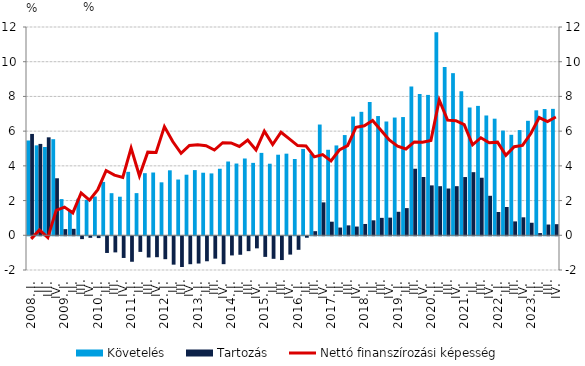
| Category | Követelés | Tartozás |
|---|---|---|
| 2008. I. | 5.462 | 5.839 |
| II. | 5.181 | 5.265 |
| III. | 5.087 | 5.644 |
| IV. | 5.537 | 3.285 |
| 2009. I. | 2.086 | 0.354 |
|          II. | 1.456 | 0.372 |
|          III. | 2.105 | -0.164 |
|          IV. | 2.045 | -0.088 |
| 2010. I. | 2.232 | -0.104 |
|          II. | 3.074 | -0.961 |
|          III. | 2.425 | -0.928 |
|          IV. | 2.222 | -1.249 |
| 2011. I. | 3.657 | -1.468 |
|          II. | 2.429 | -0.9 |
|          III. | 3.579 | -1.222 |
|          IV. | 3.617 | -1.205 |
| 2012. I. | 3.052 | -1.32 |
|          II. | 3.743 | -1.634 |
|          III. | 3.213 | -1.77 |
|          IV. | 3.491 | -1.609 |
| 2013. I. | 3.756 | -1.57 |
| II. | 3.605 | -1.439 |
|          III. | 3.565 | -1.288 |
| IV. | 3.833 | -1.607 |
| 2014. I. | 4.25 | -1.103 |
| II. | 4.134 | -1.065 |
|          III. | 4.424 | -0.856 |
| IV. | 4.172 | -0.695 |
| 2015. I. | 4.747 | -1.186 |
| II. | 4.124 | -1.298 |
|          III. | 4.642 | -1.369 |
| IV. | 4.702 | -1.054 |
| 2016. I. | 4.394 | -0.779 |
| II. | 4.974 | -0.083 |
|          III. | 4.698 | 0.237 |
| IV. | 6.381 | 1.896 |
| 2017. I. | 4.927 | 0.783 |
| II. | 5.177 | 0.446 |
|          III. | 5.775 | 0.571 |
| IV. | 6.84 | 0.504 |
| 2018. I. | 7.113 | 0.652 |
| II. | 7.684 | 0.862 |
|          III. | 6.87 | 1.004 |
| IV. | 6.556 | 1.017 |
| 2019. I. | 6.783 | 1.355 |
| II. | 6.812 | 1.566 |
|          III. | 8.575 | 3.834 |
| IV. | 8.138 | 3.357 |
| 2020. I. | 8.087 | 2.875 |
| II. | 11.699 | 2.829 |
|          III. | 9.688 | 2.695 |
| IV. | 9.341 | 2.83 |
| 2021. I. | 8.305 | 3.355 |
| II. | 7.369 | 3.636 |
|          III. | 7.454 | 3.315 |
| IV. | 6.902 | 2.275 |
| 2022. I. | 6.718 | 1.341 |
| II. | 6.033 | 1.63 |
|          III. | 5.789 | 0.8 |
| IV. | 6.061 | 1.035 |
| 2023. I. | 6.596 | 0.722 |
| II. | 7.199 | 0.128 |
|          III. | 7.282 | 0.62 |
| IV. | 7.284 | 0.64 |